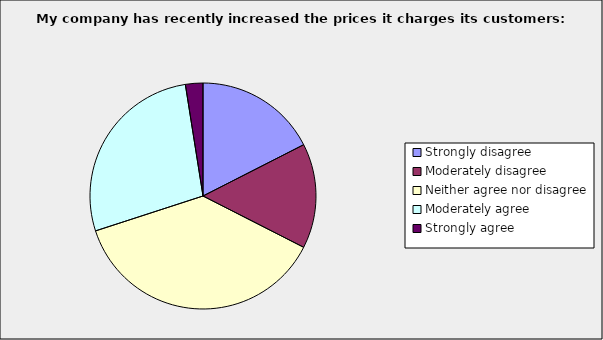
| Category | Series 0 |
|---|---|
| Strongly disagree | 0.175 |
| Moderately disagree | 0.15 |
| Neither agree nor disagree | 0.375 |
| Moderately agree | 0.275 |
| Strongly agree | 0.025 |